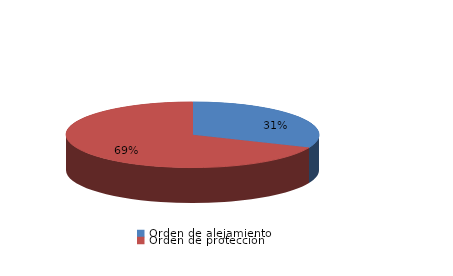
| Category | Series 0 |
|---|---|
| Orden de alejamiento | 48 |
| Orden de protección | 105 |